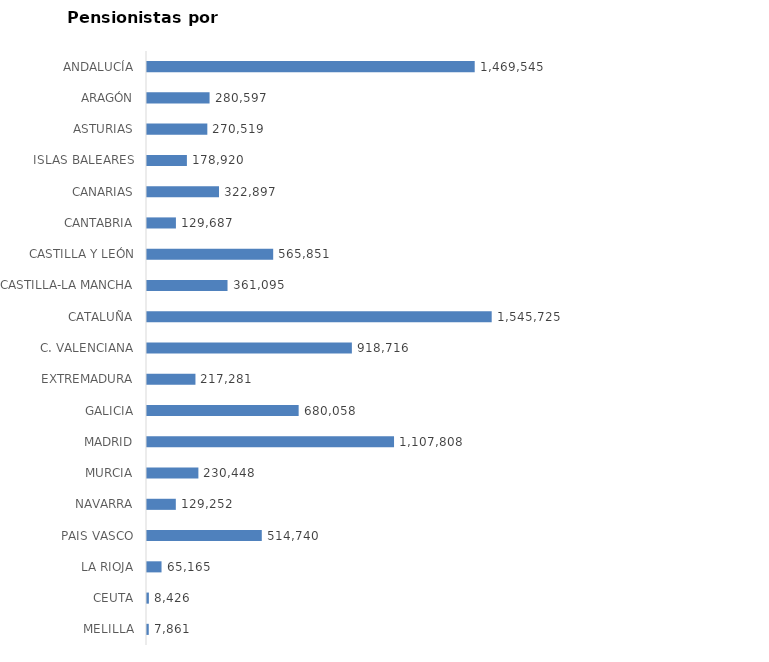
| Category | AMBOS SEXOS (1) |
|---|---|
| ANDALUCÍA | 1469545 |
| ARAGÓN | 280597 |
| ASTURIAS | 270519 |
| ISLAS BALEARES | 178920 |
| CANARIAS | 322897 |
| CANTABRIA | 129687 |
| CASTILLA Y LEÓN | 565851 |
| CASTILLA-LA MANCHA | 361095 |
| CATALUÑA | 1545725 |
| C. VALENCIANA | 918716 |
| EXTREMADURA | 217281 |
| GALICIA | 680058 |
| MADRID | 1107808 |
| MURCIA | 230448 |
| NAVARRA | 129252 |
| PAIS VASCO | 514740 |
| LA RIOJA | 65165 |
| CEUTA | 8426 |
| MELILLA | 7861 |